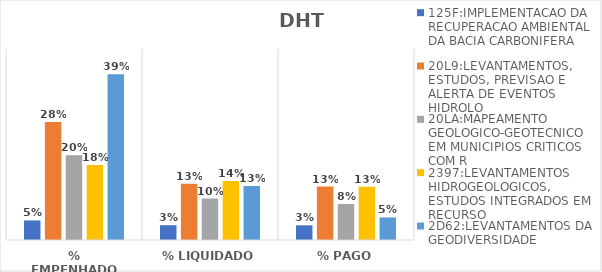
| Category | 125F:IMPLEMENTACAO DA RECUPERACAO AMBIENTAL DA BACIA CARBONIFERA | 20L9:LEVANTAMENTOS, ESTUDOS, PREVISAO E ALERTA DE EVENTOS HIDROLO | 20LA:MAPEAMENTO GEOLOGICO-GEOTECNICO EM MUNICIPIOS CRITICOS COM R | 2397:LEVANTAMENTOS HIDROGEOLOGICOS, ESTUDOS INTEGRADOS EM RECURSO | 2D62:LEVANTAMENTOS DA GEODIVERSIDADE |
|---|---|---|---|---|---|
| % EMPENHADO | 0.046 | 0.278 | 0.199 | 0.177 | 0.39 |
| % LIQUIDADO | 0.035 | 0.133 | 0.098 | 0.139 | 0.127 |
| % PAGO | 0.035 | 0.126 | 0.085 | 0.125 | 0.053 |